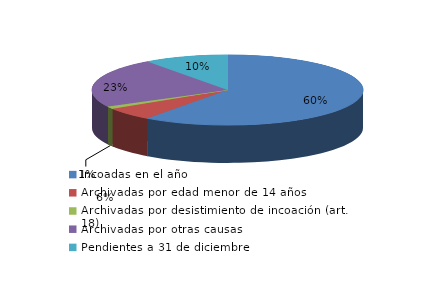
| Category | Series 0 |
|---|---|
| Incoadas en el año | 1242 |
| Archivadas por edad menor de 14 años | 125 |
| Archivadas por desistimiento de incoación (art. 18) | 23 |
| Archivadas por otras causas | 472 |
| Pendientes a 31 de diciembre | 207 |